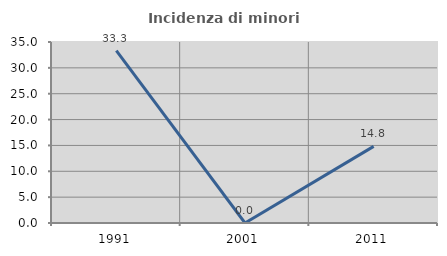
| Category | Incidenza di minori stranieri |
|---|---|
| 1991.0 | 33.333 |
| 2001.0 | 0 |
| 2011.0 | 14.815 |